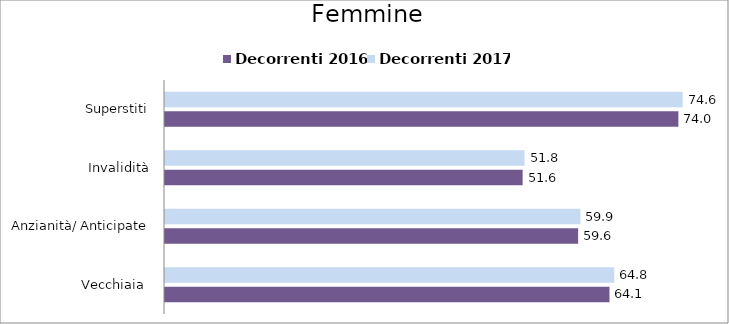
| Category | Decorrenti 2016 | Decorrenti 2017 |
|---|---|---|
| Vecchiaia  | 64.07 | 64.76 |
| Anzianità/ Anticipate | 59.55 | 59.88 |
| Invalidità | 51.55 | 51.82 |
| Superstiti | 74 | 74.62 |